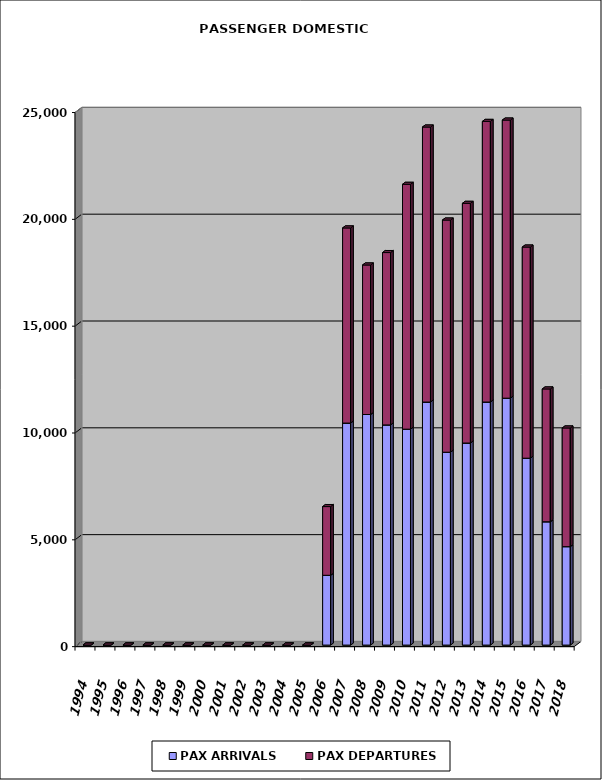
| Category | PAX ARRIVALS | PAX DEPARTURES |
|---|---|---|
| 1994.0 | 0 | 0 |
| 1995.0 | 0 | 0 |
| 1996.0 | 0 | 0 |
| 1997.0 | 0 | 0 |
| 1998.0 | 0 | 0 |
| 1999.0 | 0 | 0 |
| 2000.0 | 0 | 0 |
| 2001.0 | 0 | 0 |
| 2002.0 | 0 | 0 |
| 2003.0 | 0 | 0 |
| 2004.0 | 0 | 0 |
| 2005.0 | 0 | 0 |
| 2006.0 | 3267 | 3217 |
| 2007.0 | 10392 | 9134 |
| 2008.0 | 10793 | 6999 |
| 2009.0 | 10306 | 8067 |
| 2010.0 | 10107 | 11460 |
| 2011.0 | 11376 | 12873 |
| 2012.0 | 9028 | 10867 |
| 2013.0 | 9458 | 11219 |
| 2014.0 | 11377 | 13135 |
| 2015.0 | 11557 | 13018 |
| 2016.0 | 8748 | 9883 |
| 2017.0 | 5772 | 6217 |
| 2018.0 | 4608 | 5555 |